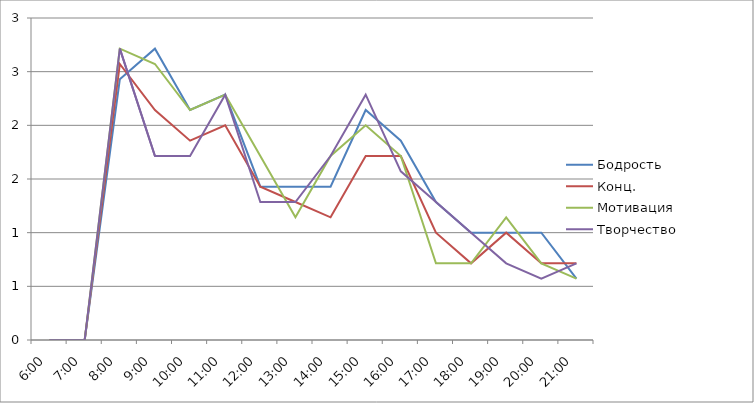
| Category | Бодрость | Конц. | Мотивация | Творчество |
|---|---|---|---|---|
| 0.25 | 0 | 0 | 0 | 0 |
| 0.2916666666666667 | 0 | 0 | 0 | 0 |
| 0.3333333333333333 | 2.429 | 2.571 | 2.714 | 2.714 |
| 0.375 | 2.714 | 2.143 | 2.571 | 1.714 |
| 0.4166666666666667 | 2.143 | 1.857 | 2.143 | 1.714 |
| 0.4583333333333333 | 2.286 | 2 | 2.286 | 2.286 |
| 0.5 | 1.429 | 1.429 | 1.714 | 1.286 |
| 0.5416666666666666 | 1.429 | 1.286 | 1.143 | 1.286 |
| 0.5833333333333334 | 1.429 | 1.143 | 1.714 | 1.714 |
| 0.625 | 2.143 | 1.714 | 2 | 2.286 |
| 0.6666666666666666 | 1.857 | 1.714 | 1.714 | 1.571 |
| 0.7083333333333334 | 1.286 | 1 | 0.714 | 1.286 |
| 0.75 | 1 | 0.714 | 0.714 | 1 |
| 0.7916666666666666 | 1 | 1 | 1.143 | 0.714 |
| 0.8333333333333334 | 1 | 0.714 | 0.714 | 0.571 |
| 0.875 | 0.571 | 0.714 | 0.571 | 0.714 |